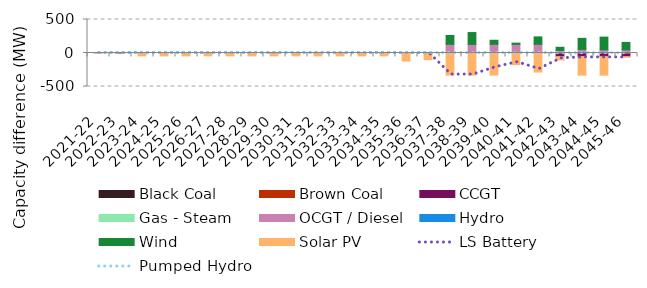
| Category | Black Coal | Brown Coal | CCGT | Gas - Steam | OCGT / Diesel | Hydro | Wind | Solar PV |
|---|---|---|---|---|---|---|---|---|
| 2021-22 | 0 | 0 | 0 | 0 | 0 | 0 | 0 | -0.001 |
| 2022-23 | 0 | 0 | 0 | 0 | 0 | 0 | -0.001 | -0.001 |
| 2023-24 | 0 | 0 | 0 | 0 | 0.001 | 0 | -0.002 | -43.203 |
| 2024-25 | 0 | 0 | 0 | 0 | 0.001 | 0 | -0.026 | -43.128 |
| 2025-26 | 0 | 0 | 0 | 0 | 0.001 | 0 | 0.032 | -43.128 |
| 2026-27 | 0 | 0 | 0 | 0 | 0.001 | 0 | -0.062 | -42.925 |
| 2027-28 | 0 | 0 | 0 | 0 | 0.001 | 0 | -0.062 | -42.924 |
| 2028-29 | 0 | 0 | 0 | 0 | 0.001 | 0 | 0.339 | -43.142 |
| 2029-30 | 0 | 0 | 0 | 0 | 0.001 | 0 | 0.338 | -43.142 |
| 2030-31 | 0 | 0 | 0 | 0 | 0.001 | 0 | 0.338 | -43.142 |
| 2031-32 | 0 | 0 | 0 | 0 | 0.001 | 0 | 0.338 | -43.143 |
| 2032-33 | 0 | 0 | 0 | 0 | 0.001 | 0 | 0.338 | -43.143 |
| 2033-34 | 0 | 0 | 0 | 0 | 0.001 | 0 | 0.338 | -43.143 |
| 2034-35 | 0 | 0 | 0 | 0 | 0.001 | 0 | 0.338 | -43.143 |
| 2035-36 | 0 | 0 | 0 | 0 | 0.001 | 0 | 0.33 | -120.683 |
| 2036-37 | 0 | 0 | 0 | 0 | 0.001 | 0 | 0.329 | -99.028 |
| 2037-38 | 0 | 0 | -0.001 | 0 | 129.354 | 0 | 133.215 | -329.667 |
| 2038-39 | 0 | 0 | -0.001 | 0 | 129.354 | 0 | 175.653 | -329.667 |
| 2039-40 | 0 | 0 | -0.001 | 0 | 129.354 | 0 | 60.898 | -329.666 |
| 2040-41 | 0 | 0 | -0.001 | 0 | 129.354 | 0 | 17.958 | -174.06 |
| 2041-42 | 0 | 0 | -0.001 | 0 | 129.354 | 0 | 111.057 | -284.536 |
| 2042-43 | 0 | 0 | -54.023 | 0 | 37.749 | 0 | 47.669 | -50.149 |
| 2043-44 | 0 | 0 | -54.023 | 0 | 53.313 | 0 | 165.39 | -277.092 |
| 2044-45 | 0 | 0 | -54.023 | 0 | 47.166 | 0 | 190.189 | -277.092 |
| 2045-46 | 0 | 0 | -54.023 | 0 | 47.166 | 0 | 111.12 | -7.287 |